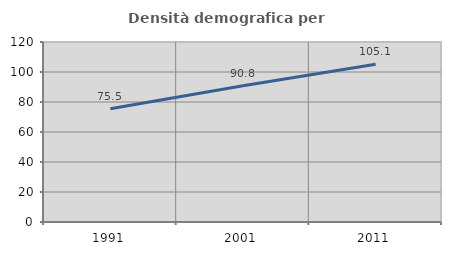
| Category | Densità demografica |
|---|---|
| 1991.0 | 75.51 |
| 2001.0 | 90.833 |
| 2011.0 | 105.147 |